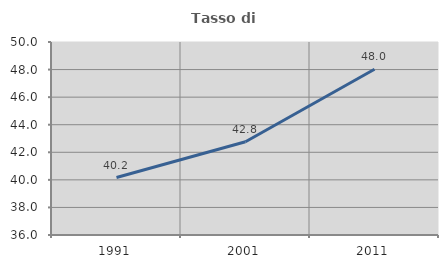
| Category | Tasso di occupazione   |
|---|---|
| 1991.0 | 40.169 |
| 2001.0 | 42.766 |
| 2011.0 | 48.025 |